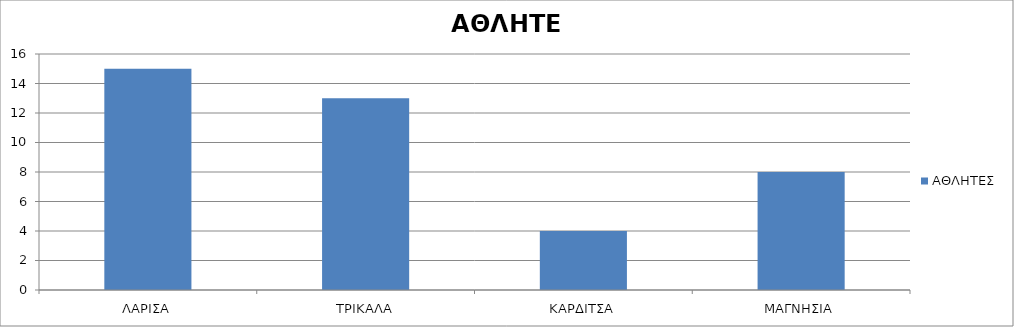
| Category | ΑΘΛΗΤΕΣ |
|---|---|
| ΛΑΡΙΣΑ | 15 |
| ΤΡΙΚΑΛΑ | 13 |
| ΚΑΡΔΙΤΣΑ | 4 |
| ΜΑΓΝΗΣΙΑ | 8 |